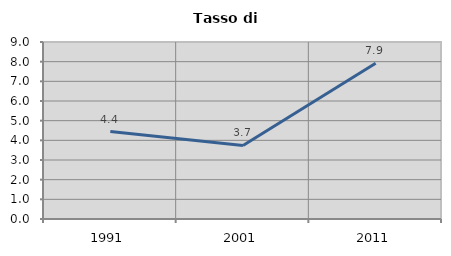
| Category | Tasso di disoccupazione   |
|---|---|
| 1991.0 | 4.444 |
| 2001.0 | 3.738 |
| 2011.0 | 7.919 |